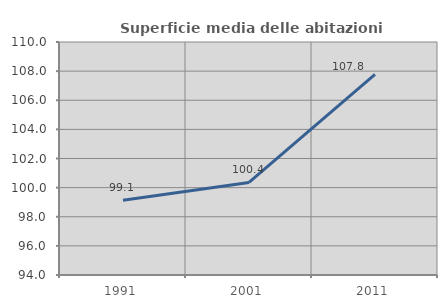
| Category | Superficie media delle abitazioni occupate |
|---|---|
| 1991.0 | 99.129 |
| 2001.0 | 100.355 |
| 2011.0 | 107.774 |